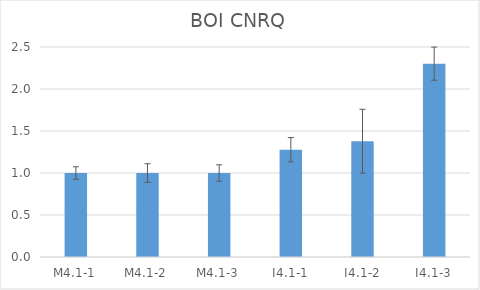
| Category | BOI CNRQ |
|---|---|
| M4.1-1 | 1 |
| M4.1-2 | 1 |
| M4.1-3 | 1 |
| I4.1-1 | 1.278 |
| I4.1-2 | 1.378 |
| I4.1-3 | 2.302 |